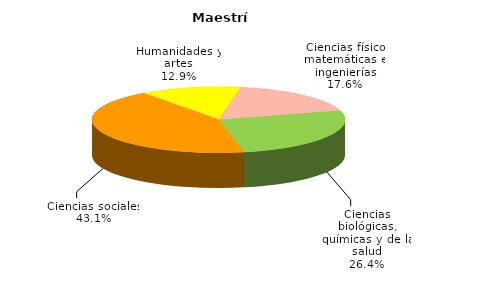
| Category | Series 0 |
|---|---|
| Ciencias físico matemáticas e ingenierías | 1706 |
| Ciencias biológicas, químicas y de la salud | 2555 |
| Ciencias sociales | 4171 |
| Humanidades y artes | 1248 |